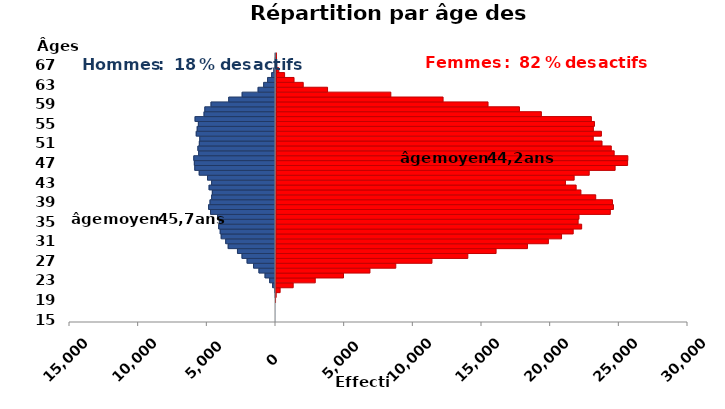
| Category | âge  | Hommes | Femmes |
|---|---|---|---|
| 15.0 | 15 | 0 | 0 |
| 16.0 | 16 | 0 | 0 |
| 17.0 | 17 | 0 | 0 |
| 18.0 | 18 | 0 | 0 |
| 19.0 | 19 | 0 | 4 |
| 20.0 | 20 | -11 | 59 |
| 21.0 | 21 | -42 | 353 |
| 22.0 | 22 | -206 | 1303 |
| 23.0 | 23 | -424 | 2908 |
| 24.0 | 24 | -760 | 4965 |
| 25.0 | 25 | -1203 | 6889 |
| 26.0 | 26 | -1597 | 8769 |
| 27.0 | 27 | -2067 | 11403 |
| 28.0 | 28 | -2436 | 14014 |
| 29.0 | 29 | -2769 | 16069 |
| 30.0 | 30 | -3443 | 18353 |
| 31.0 | 31 | -3624 | 19876 |
| 32.0 | 32 | -3952 | 20834 |
| 33.0 | 33 | -4025 | 21681 |
| 34.0 | 34 | -4135 | 22296 |
| 35.0 | 35 | -4087 | 22038 |
| 36.0 | 36 | -4218 | 22098 |
| 37.0 | 37 | -4730 | 24379 |
| 38.0 | 38 | -4870 | 24605 |
| 39.0 | 39 | -4767 | 24535 |
| 40.0 | 40 | -4648 | 23314 |
| 41.0 | 41 | -4598 | 22234 |
| 42.0 | 42 | -4834 | 21887 |
| 43.0 | 43 | -4650 | 21105 |
| 44.0 | 44 | -4950 | 21739 |
| 45.0 | 45 | -5554 | 22836 |
| 46.0 | 46 | -5876 | 24720 |
| 47.0 | 47 | -5908 | 25628 |
| 48.0 | 48 | -5947 | 25645 |
| 49.0 | 49 | -5595 | 24649 |
| 50.0 | 50 | -5648 | 24436 |
| 51.0 | 51 | -5545 | 23761 |
| 52.0 | 52 | -5512 | 23122 |
| 53.0 | 53 | -5770 | 23715 |
| 54.0 | 54 | -5699 | 23128 |
| 55.0 | 55 | -5615 | 23208 |
| 56.0 | 56 | -5854 | 22981 |
| 57.0 | 57 | -5202 | 19340 |
| 58.0 | 58 | -5144 | 17743 |
| 59.0 | 59 | -4693 | 15453 |
| 60.0 | 60 | -3404 | 12179 |
| 61.0 | 61 | -2426 | 8373 |
| 62.0 | 62 | -1265 | 3765 |
| 63.0 | 63 | -859 | 1992 |
| 64.0 | 64 | -574 | 1322 |
| 65.0 | 65 | -279 | 634 |
| 66.0 | 66 | -120 | 210 |
| 67.0 | 67 | -22 | 55 |
| 68.0 | 68 | -13 | 36 |
| 69.0 | 69 | -1 | 30 |